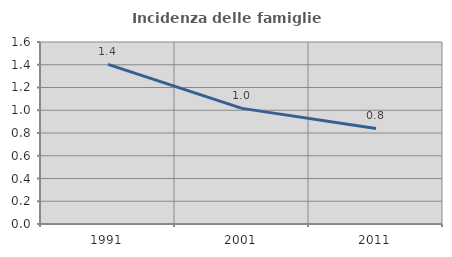
| Category | Incidenza delle famiglie numerose |
|---|---|
| 1991.0 | 1.403 |
| 2001.0 | 1.017 |
| 2011.0 | 0.84 |